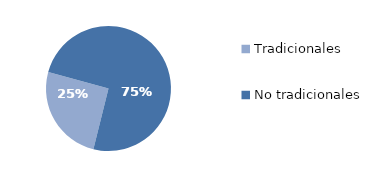
| Category | Series 0 |
|---|---|
| Tradicionales | 184.237 |
| No tradicionales | 542.163 |